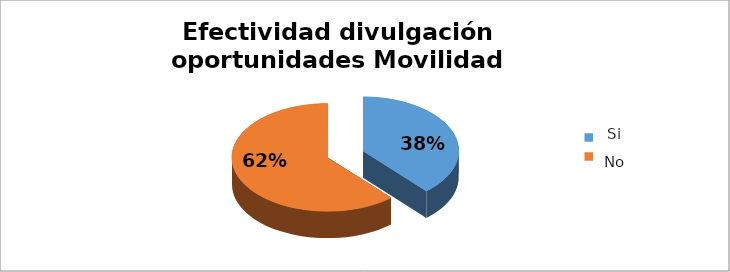
| Category | Series 0 |
|---|---|
| 0 | 0.385 |
| 1 | 0.615 |